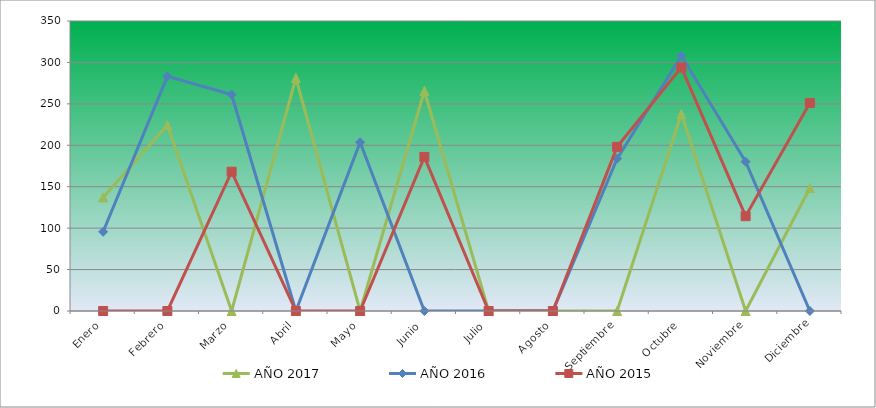
| Category | AÑO 2017 | AÑO 2016 | AÑO 2015 |
|---|---|---|---|
| Enero | 137.041 | 95.594 | 0 |
| Febrero | 224.379 | 283.134 | 0 |
| Marzo | 0 | 261.242 | 168.09 |
| Abril | 281.183 | 0 | 0 |
| Mayo | 0 | 203.593 | 0 |
| Junio | 265.562 | 0 | 185.972 |
| Julio | 0 | 0 | 0 |
| Agosto | 0 | 0 | 0 |
| Septiembre | 0 | 183.891 | 198.132 |
| Octubre | 237.87 | 307.944 | 293.979 |
| Noviembre | 0 | 180.242 | 114.444 |
| Diciembre | 148.402 | 0 | 251.062 |